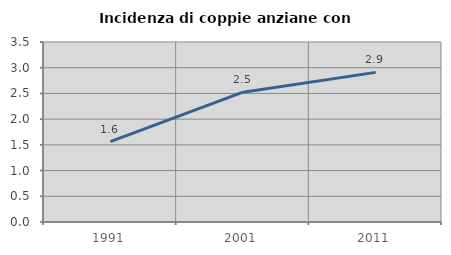
| Category | Incidenza di coppie anziane con figli |
|---|---|
| 1991.0 | 1.565 |
| 2001.0 | 2.525 |
| 2011.0 | 2.91 |